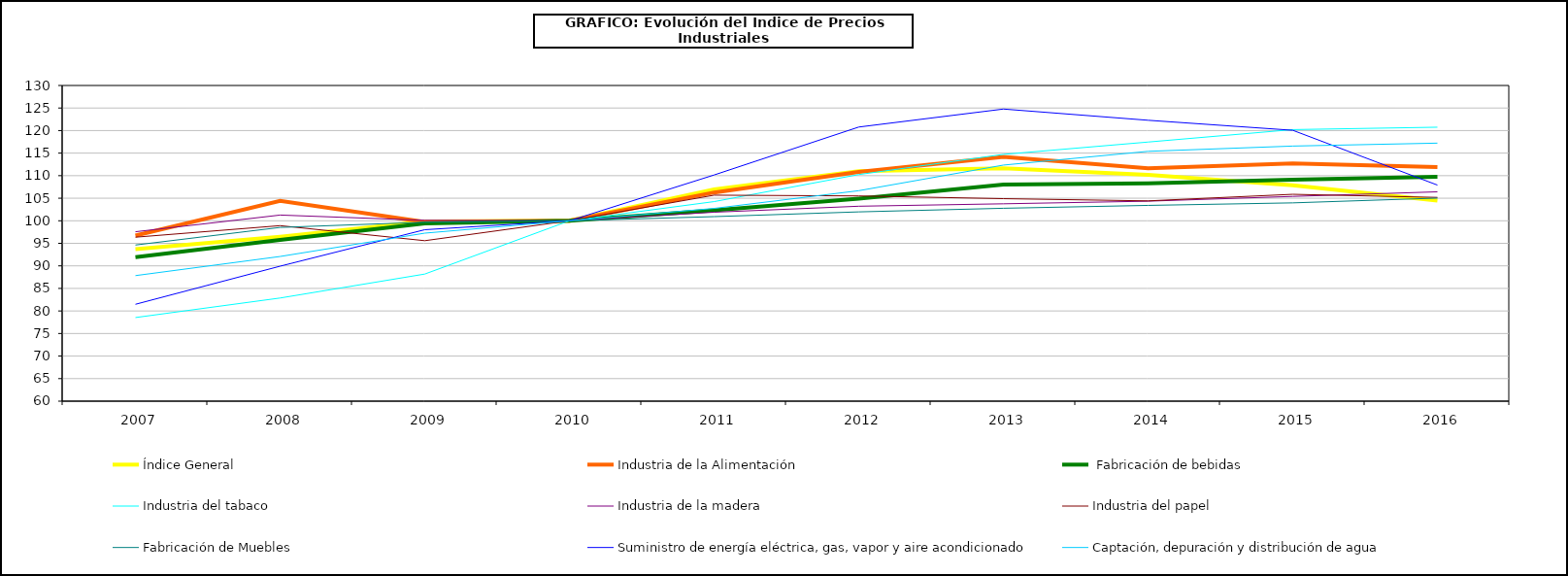
| Category | Índice General | Industria de la Alimentación |  Fabricación de bebidas | Industria del tabaco | Industria de la madera  | Industria del papel | Fabricación de Muebles | Suministro de energía eléctrica, gas, vapor y aire acondicionado | Captación, depuración y distribución de agua |
|---|---|---|---|---|---|---|---|---|---|
|    2007 | 93.706 | 96.71 | 91.954 | 78.537 | 97.565 | 96.357 | 94.621 | 81.483 | 87.838 |
|    2008 | 96.445 | 104.426 | 95.766 | 82.872 | 101.264 | 98.919 | 98.524 | 89.929 | 92.081 |
|    2009 | 99.843 | 99.719 | 99.415 | 88.185 | 100.106 | 95.581 | 99.682 | 98.016 | 97.257 |
|    2010 | 100 | 100 | 100 | 100 | 100 | 100 | 100 | 100 | 100 |
|    2011 | 106.941 | 106.276 | 102.335 | 104.249 | 101.897 | 105.677 | 100.917 | 110.154 | 102.743 |
|    2012 | 110.979 | 110.812 | 104.885 | 110.242 | 103.223 | 105.51 | 101.97 | 120.785 | 106.668 |
|    2013 | 111.655 | 114.189 | 108.037 | 114.724 | 103.761 | 104.902 | 102.772 | 124.771 | 112.346 |
|    2014 | 110.162 | 111.649 | 108.315 | 117.457 | 104.343 | 104.411 | 103.41 | 122.284 | 115.395 |
|    2015 | 107.884 | 112.716 | 109.099 | 120.215 | 105.401 | 105.869 | 103.972 | 120.065 | 116.563 |
|    2016 | 104.501 | 111.909 | 109.728 | 120.747 | 106.42 | 105.183 | 105.027 | 107.915 | 117.214 |